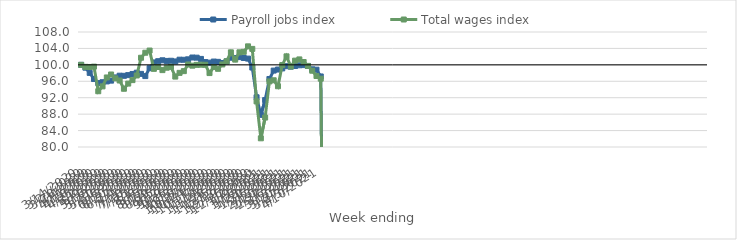
| Category | Payroll jobs index | Total wages index |
|---|---|---|
| 14/03/2020 | 100 | 100 |
| 21/03/2020 | 99.313 | 99.515 |
| 28/03/2020 | 98.044 | 99.483 |
| 04/04/2020 | 96.552 | 99.568 |
| 11/04/2020 | 95.565 | 93.574 |
| 18/04/2020 | 95.773 | 94.76 |
| 25/04/2020 | 95.966 | 96.932 |
| 02/05/2020 | 96.158 | 97.654 |
| 09/05/2020 | 96.939 | 96.715 |
| 16/05/2020 | 97.36 | 96.193 |
| 23/05/2020 | 97.331 | 94.18 |
| 30/05/2020 | 97.502 | 95.44 |
| 06/06/2020 | 97.779 | 96.283 |
| 13/06/2020 | 98.095 | 97.414 |
| 20/06/2020 | 97.803 | 101.728 |
| 27/06/2020 | 97.265 | 102.952 |
| 04/07/2020 | 99.185 | 103.482 |
| 11/07/2020 | 100.592 | 99.026 |
| 18/07/2020 | 100.892 | 99.475 |
| 25/07/2020 | 101.11 | 98.72 |
| 01/08/2020 | 100.958 | 99.304 |
| 08/08/2020 | 100.999 | 99.505 |
| 15/08/2020 | 100.834 | 97.144 |
| 22/08/2020 | 101.257 | 98.049 |
| 29/08/2020 | 101.235 | 98.471 |
| 05/09/2020 | 101.348 | 100.088 |
| 12/09/2020 | 101.79 | 99.803 |
| 19/09/2020 | 101.753 | 100 |
| 26/09/2020 | 101.448 | 100.035 |
| 03/10/2020 | 100.683 | 100.018 |
| 10/10/2020 | 100.535 | 98.002 |
| 17/10/2020 | 100.805 | 99.464 |
| 24/10/2020 | 100.732 | 99.035 |
| 31/10/2020 | 100.45 | 100.097 |
| 07/11/2020 | 100.848 | 100.863 |
| 14/11/2020 | 101.737 | 103.048 |
| 21/11/2020 | 101.67 | 101.278 |
| 28/11/2020 | 101.89 | 103.053 |
| 05/12/2020 | 101.666 | 103.168 |
| 12/12/2020 | 101.522 | 104.505 |
| 19/12/2020 | 99.343 | 103.885 |
| 26/12/2020 | 92.113 | 91.099 |
| 02/01/2021 | 87.824 | 82.118 |
| 09/01/2021 | 91.425 | 87.168 |
| 16/01/2021 | 96.558 | 95.969 |
| 23/01/2021 | 98.604 | 96.245 |
| 30/01/2021 | 98.861 | 94.792 |
| 06/02/2021 | 99.135 | 99.944 |
| 13/02/2021 | 99.679 | 102.072 |
| 20/02/2021 | 99.558 | 99.597 |
| 27/02/2021 | 99.719 | 101.028 |
| 06/03/2021 | 99.894 | 101.326 |
| 13/03/2021 | 99.94 | 100.694 |
| 20/03/2021 | 99.726 | 99.741 |
| 27/03/2021 | 98.915 | 98.576 |
| 03/04/2021 | 98.82 | 97.285 |
| 10/04/2021 | 97.175 | 96.631 |